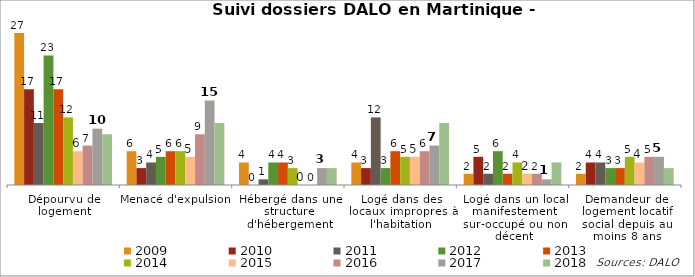
| Category | 2009 | 2010 | 2011 | 2012 | 2013 | 2014 | 2015 | 2016 | 2017 | 2018 |
|---|---|---|---|---|---|---|---|---|---|---|
| Dépourvu de logement | 27 | 17 | 11 | 23 | 17 | 12 | 6 | 7 | 10 | 9 |
| Menacé d'expulsion | 6 | 3 | 4 | 5 | 6 | 6 | 5 | 9 | 15 | 11 |
| Hébergé dans une structure d'hébergement | 4 | 0 | 1 | 4 | 4 | 3 | 0 | 0 | 3 | 3 |
| Logé dans des locaux impropres à l'habitation | 4 | 3 | 12 | 3 | 6 | 5 | 5 | 6 | 7 | 11 |
| Logé dans un local manifestement sur-occupé ou non décent | 2 | 5 | 2 | 6 | 2 | 4 | 2 | 2 | 1 | 4 |
| Demandeur de logement locatif social depuis au moins 8 ans | 2 | 4 | 4 | 3 | 3 | 5 | 4 | 5 | 5 | 3 |